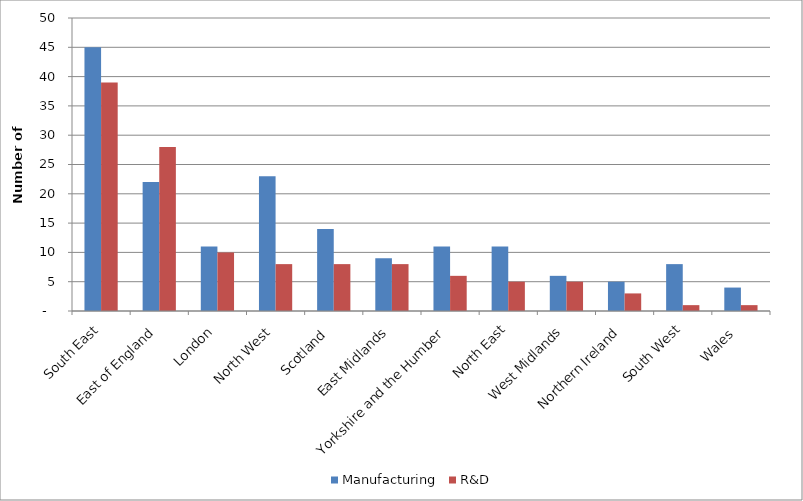
| Category | Manufacturing | R&D |
|---|---|---|
| South East | 45 | 39 |
| East of England | 22 | 28 |
| London | 11 | 10 |
| North West | 23 | 8 |
| Scotland  | 14 | 8 |
| East Midlands | 9 | 8 |
| Yorkshire and the Humber | 11 | 6 |
| North East | 11 | 5 |
| West Midlands | 6 | 5 |
| Northern Ireland | 5 | 3 |
| South West | 8 | 1 |
| Wales  | 4 | 1 |